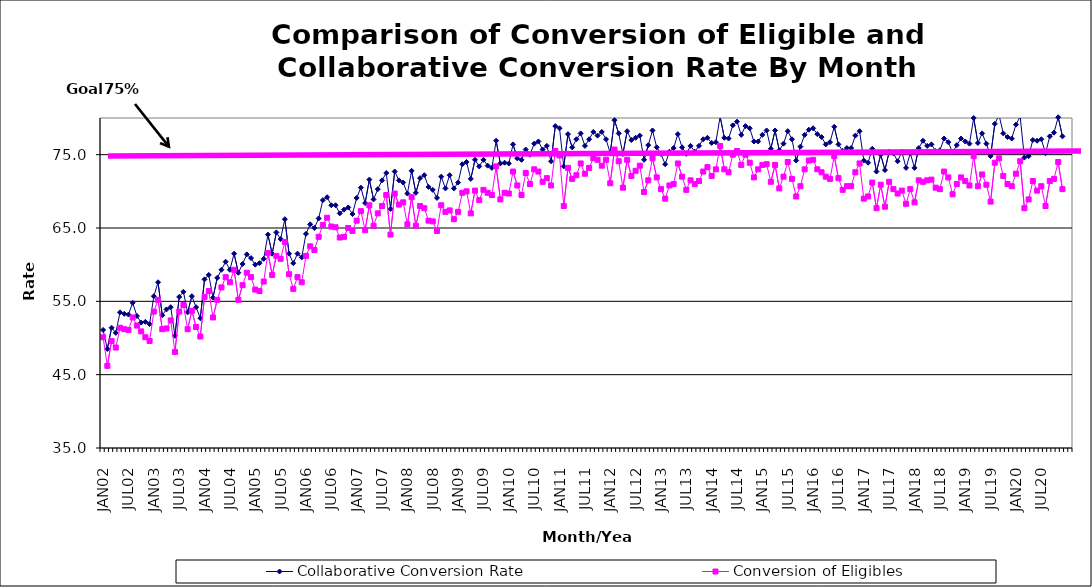
| Category | Collaborative Conversion Rate | Conversion of Eligibles |
|---|---|---|
| JAN02 | 51.1 | 50.1 |
| FEB02 | 48.5 | 46.2 |
| MAR02 | 51.4 | 49.6 |
| APR02 | 50.7 | 48.7 |
| MAY02 | 53.5 | 51.4 |
| JUN02 | 53.3 | 51.2 |
| JUL02 | 53.2 | 51.1 |
| AUG02 | 54.8 | 52.8 |
| SEP02 | 53 | 51.7 |
| OCT02 | 52.1 | 50.9 |
| NOV02 | 52.2 | 50.1 |
| DEC02 | 51.9 | 49.6 |
| JAN03 | 55.7 | 53.6 |
| FEB03 | 57.6 | 55.2 |
| MAR03 | 53.1 | 51.2 |
| APR03 | 53.9 | 51.3 |
| MAY03 | 54.2 | 52.4 |
| JUN03 | 50.3 | 48.1 |
| JUL03 | 55.6 | 53.6 |
| AUG03 | 56.3 | 54.5 |
| SEP03 | 53.5 | 51.2 |
| OCT03 | 55.7 | 53.7 |
| NOV03 | 54.2 | 51.5 |
| DEC03 | 52.7 | 50.2 |
| JAN04 | 58 | 55.6 |
| FEB04 | 58.6 | 56.4 |
| MAR04 | 55.5 | 52.8 |
| APR04 | 58.2 | 55.2 |
| MAY04 | 59.3 | 56.9 |
| JUN04 | 60.4 | 58.3 |
| JUL04 | 59.3 | 57.6 |
| AUG04 | 61.5 | 59.3 |
| SEP04 | 58.9 | 55.2 |
| OCT04 | 60.1 | 57.2 |
| NOV04 | 61.4 | 58.9 |
| DEC04 | 60.9 | 58.3 |
| JAN05 | 60 | 56.6 |
| FEB05 | 60.2 | 56.4 |
| MAR05 | 60.8 | 57.7 |
| APR05 | 64.1 | 61.6 |
| MAY05 | 61.5 | 58.6 |
| JUN05 | 64.4 | 61.2 |
| JUL05 | 63.5 | 60.8 |
| AUG05 | 66.2 | 63.1 |
| SEP05 | 61.5 | 58.7 |
| OCT05 | 60.2 | 56.7 |
| NOV05 | 61.5 | 58.3 |
| DEC05 | 61 | 57.6 |
| JAN06 | 64.2 | 61.2 |
| FEB06 | 65.5 | 62.5 |
| MAR06 | 65 | 62 |
| APR06 | 66.3 | 63.8 |
| MAY06 | 68.8 | 65.4 |
| JUN06 | 69.2 | 66.4 |
| JUL06 | 68.1 | 65.2 |
| AUG06 | 68.1 | 65.1 |
| SEP06 | 67 | 63.7 |
| OCT06 | 67.5 | 63.8 |
| NOV06 | 67.8 | 65 |
| DEC06 | 66.9 | 64.6 |
| JAN07 | 69.1 | 66 |
| FEB07 | 70.5 | 67.3 |
| MAR07 | 68.4 | 64.7 |
| APR07 | 71.6 | 68.1 |
| MAY07 | 68.9 | 65.3 |
| JUN07 | 70.3 | 67 |
| JUL07 | 71.5 | 68 |
| AUG07 | 72.5 | 69.5 |
| SEP07 | 67.6 | 64.1 |
| OCT07 | 72.7 | 69.7 |
| NOV07 | 71.5 | 68.2 |
| DEC07 | 71.2 | 68.5 |
| JAN08 | 69.7 | 65.5 |
| FEB08 | 72.8 | 69.2 |
| MAR08 | 69.8 | 65.3 |
| APR08 | 71.8 | 68 |
| MAY08 | 72.2 | 67.7 |
| JUN08 | 70.6 | 66 |
| JUL08 | 70.2 | 65.9 |
| AUG08 | 69.1 | 64.6 |
| SEP08 | 72 | 68.1 |
| OCT08 | 70.4 | 67.2 |
| NOV08 | 72.2 | 67.4 |
| DEC08 | 70.4 | 66.2 |
| JAN09 | 71.2 | 67.2 |
| FEB09 | 73.7 | 69.8 |
| MAR09 | 74 | 70 |
| APR09 | 71.7 | 67 |
| MAY09 | 74.3 | 70.1 |
| JUN09 | 73.4 | 68.8 |
| JUL09 | 74.3 | 70.2 |
| AUG09 | 73.5 | 69.8 |
| SEP09 | 73.2 | 69.5 |
| OCT09 | 76.9 | 73.4 |
| NOV09 | 73.8 | 68.9 |
| DEC09 | 73.9 | 69.8 |
| JAN10 | 73.8 | 69.7 |
| FEB10 | 76.4 | 72.7 |
| MAR10 | 74.5 | 70.8 |
| APR10 | 74.3 | 69.5 |
| MAY10 | 75.7 | 72.5 |
| JUN10 | 75 | 71 |
| JUL10 | 76.5 | 73 |
| AUG10 | 76.8 | 72.7 |
| SEP10 | 75.7 | 71.3 |
| OCT10 | 76.2 | 71.8 |
| NOV10 | 74.1 | 70.8 |
| DEC10 | 78.9 | 75.5 |
| JAN11 | 78.6 | 74.9 |
| FEB11 | 73.4 | 68 |
| MAR11 | 77.8 | 73.2 |
| APR11 | 76 | 71.7 |
| MAY11 | 77.1 | 72.2 |
| JUN11 | 77.9 | 73.8 |
| JUL11 | 76.2 | 72.4 |
| AUG11 | 77.1 | 73.2 |
| SEP11 | 78.1 | 74.5 |
| OCT11 | 77.6 | 74.3 |
| NOV11 | 78.1 | 73.5 |
| DEC11 | 77.1 | 74.3 |
| JAN12 | 75.2 | 71.1 |
| FEB12 | 79.7 | 75.7 |
| MAR12 | 77.9 | 74.1 |
| APR12 | 75.1 | 70.5 |
| MAY12 | 78.2 | 74.3 |
| JUN12 | 77 | 72.1 |
| JUL12 | 77.3 | 72.8 |
| AUG12 | 77.6 | 73.5 |
| SEP12 | 74.3 | 69.9 |
| OCT12 | 76.3 | 71.5 |
| NOV12 | 78.3 | 74.5 |
| DEC12 | 76 | 71.9 |
| JAN13 | 75.1 | 70.3 |
| FEB13 | 73.7 | 69 |
| MAR13 | 75.4 | 70.8 |
| APR13 | 75.9 | 71 |
| MAY13 | 77.8 | 73.8 |
| JUN13 | 76 | 72 |
| JUL13 | 75.1 | 70.2 |
| AUG13 | 76.2 | 71.5 |
| SEP13 | 75.4 | 71 |
| OCT13 | 76.2 | 71.4 |
| NOV13 | 77.1 | 72.7 |
| DEC13 | 77.3 | 73.3 |
| JAN14 | 76.6 | 72.1 |
| FEB14 | 76.7 | 73 |
| MAR14 | 80.2 | 76.2 |
| APR14 | 77.3 | 73 |
| MAY14 | 77.2 | 72.6 |
| JUN14 | 79 | 75 |
| JUL14 | 79.5 | 75.5 |
| AUG14 | 77.7 | 73.6 |
| SEP14 | 78.9 | 75 |
| OCT14 | 78.6 | 73.9 |
| NOV14 | 76.8 | 71.9 |
| DEC14 | 76.8 | 73 |
| JAN15 | 77.7 | 73.6 |
| FEB15 | 78.3 | 73.7 |
| MAR15 | 75.8 | 71.3 |
| APR15 | 78.3 | 73.6 |
| MAY15 | 75.6 | 70.4 |
| JUN15 | 76.5 | 72 |
| JUL15 | 78.2 | 74 |
| AUG15 | 77.1 | 71.7 |
| SEP15 | 74.2 | 69.3 |
| OCT15 | 76.1 | 70.7 |
| NOV15 | 77.7 | 73 |
| DEC15 | 78.4 | 74.2 |
| JAN16 | 78.6 | 74.3 |
| FEB16 | 77.8 | 73 |
| MAR16 | 77.4 | 72.6 |
| APR16 | 76.4 | 72 |
| MAY16 | 76.7 | 71.7 |
| JUN16 | 78.8 | 74.8 |
| JUL16 | 76.4 | 71.8 |
| AUG16 | 75.5 | 70.2 |
| SEP16 | 75.9 | 70.7 |
| OCT16 | 75.9 | 70.7 |
| NOV16 | 77.6 | 72.6 |
| DEC16 | 78.2 | 73.8 |
| JAN17 | 74.2 | 69 |
| FEB17 | 73.9 | 69.3 |
| MAR17 | 75.8 | 71.2 |
| APR17 | 72.7 | 67.7 |
| MAY17 | 75 | 70.9 |
| JUN17 | 72.9 | 67.9 |
| JUL17 | 75.4 | 71.3 |
| AUG17 | 75.2 | 70.3 |
| SEP17 | 74.1 | 69.7 |
| OCT17 | 75.4 | 70.1 |
| NOV17 | 73.2 | 68.3 |
| DEC17 | 75.2 | 70.3 |
| JAN18 | 73.2 | 68.5 |
| FEB18 | 75.9 | 71.5 |
| MAR18 | 76.9 | 71.3 |
| APR18 | 76.2 | 71.5 |
| MAY18 | 76.4 | 71.6 |
| JUN18 | 75.5 | 70.5 |
| JUL18 | 75.6 | 70.3 |
| AUG18 | 77.2 | 72.7 |
| SEP18 | 76.7 | 71.9 |
| OCT18 | 75.3 | 69.6 |
| NOV18 | 76.3 | 71 |
| DEC18 | 77.2 | 71.9 |
| JAN19 | 76.8 | 71.4 |
| FEB19 | 76.5 | 70.8 |
| MAR19 | 80 | 74.8 |
| APR19 | 76.6 | 70.7 |
| MAY19 | 77.9 | 72.3 |
| JUN19 | 76.5 | 70.9 |
| JUL19 | 74.8 | 68.6 |
| AUG19 | 79.2 | 73.9 |
| SEP19 | 80.4 | 74.5 |
| OCT19 | 77.9 | 72.1 |
| NOV19 | 77.4 | 71 |
| DEC19 | 77.2 | 70.7 |
| JAN20 | 79.1 | 72.4 |
| FEB20 | 80.2 | 74.1 |
| MAR20 | 74.6 | 67.7 |
| APR20 | 74.8 | 68.9 |
| MAY20 | 77 | 71.4 |
| JUN20 | 76.9 | 70.1 |
| JUL20 | 77.1 | 70.7 |
| AUG20 | 75.2 | 68 |
| SEP20 | 77.5 | 71.4 |
| OCT20 | 78 | 71.7 |
| NOV20 | 80.1 | 74 |
| DEC20 | 77.5 | 70.3 |